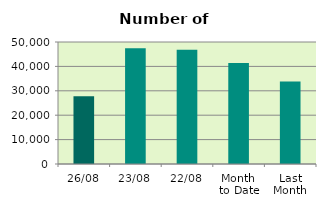
| Category | Series 0 |
|---|---|
| 26/08 | 27812 |
| 23/08 | 47450 |
| 22/08 | 46846 |
| Month 
to Date | 41369.111 |
| Last
Month | 33803.652 |